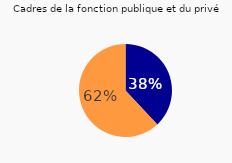
| Category | Series 0 |
|---|---|
| Oui | 38 |
| Non | 62 |